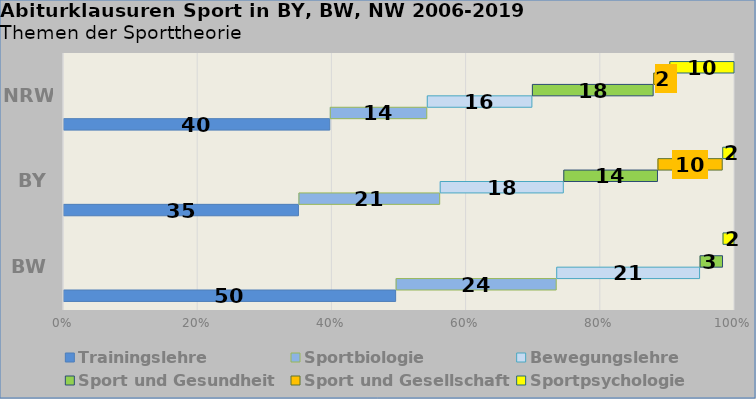
| Category | Trainingslehre  | Sportbiologie | Bewegungslehre | Sport und Gesundheit | Sport und Gesellschaft | Sportpsychologie |
|---|---|---|---|---|---|---|
| BW | 49.573 | 23.932 | 21.368 | 3.419 | 0 | 1.709 |
| BY | 35.088 | 21.053 | 18.421 | 14.035 | 9.649 | 1.754 |
| NRW | 39.759 | 14.458 | 15.663 | 18.072 | 2.41 | 9.639 |